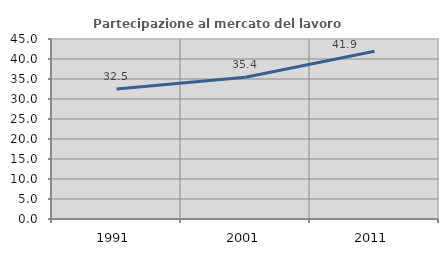
| Category | Partecipazione al mercato del lavoro  femminile |
|---|---|
| 1991.0 | 32.479 |
| 2001.0 | 35.423 |
| 2011.0 | 41.935 |